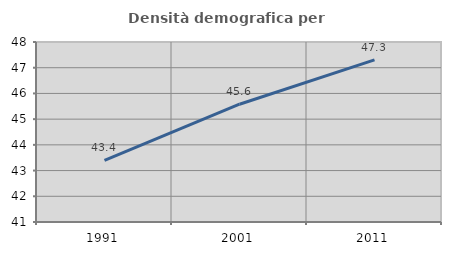
| Category | Densità demografica |
|---|---|
| 1991.0 | 43.396 |
| 2001.0 | 45.58 |
| 2011.0 | 47.306 |